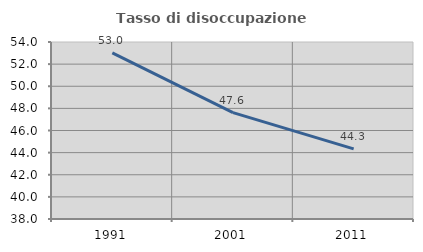
| Category | Tasso di disoccupazione giovanile  |
|---|---|
| 1991.0 | 53.02 |
| 2001.0 | 47.619 |
| 2011.0 | 44.34 |